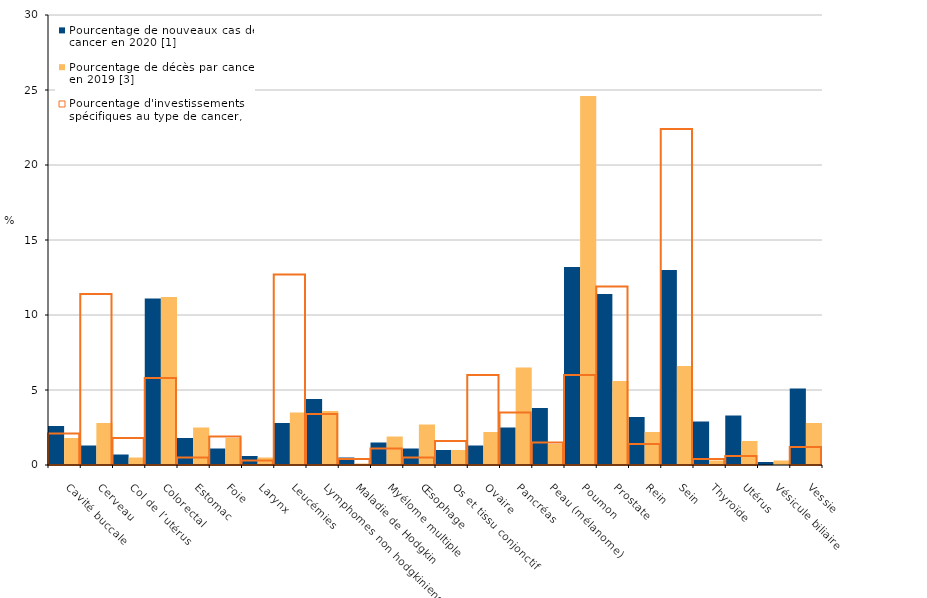
| Category | Pourcentage de nouveaux cas de cancer en 2020 [1] | Pourcentage de décès par cancer en 2019 [3] |
|---|---|---|
| Cavité buccale | 2.6 | 1.8 |
| Cerveau | 1.3 | 2.8 |
| Col de l’utérus | 0.7 | 0.5 |
| Colorectal | 11.1 | 11.2 |
| Estomac | 1.8 | 2.5 |
| Foie | 1.1 | 1.8 |
| Larynx | 0.6 | 0.5 |
| Leucémies | 2.8 | 3.5 |
| Lymphomes non hodgkiniens | 4.4 | 3.6 |
| Maladie de Hodgkin | 0.5 | 0.1 |
| Myélome multiple | 1.5 | 1.9 |
| Œsophage | 1.1 | 2.7 |
| Os et tissu conjonctif | 1 | 1 |
| Ovaire | 1.3 | 2.2 |
| Pancréas | 2.5 | 6.5 |
| Peau (mélanome) | 3.8 | 1.4 |
| Poumon | 13.2 | 24.6 |
| Prostate | 11.4 | 5.6 |
| Rein | 3.2 | 2.2 |
| Sein | 13 | 6.6 |
| Thyroïde | 2.9 | 0.3 |
| Utérus | 3.3 | 1.6 |
| Vésicule biliaire | 0.2 | 0.3 |
| Vessie | 5.1 | 2.8 |